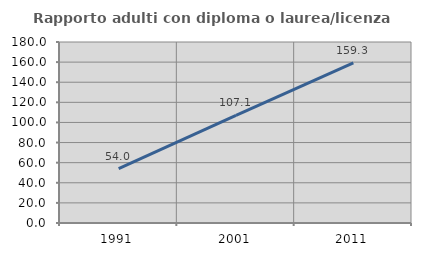
| Category | Rapporto adulti con diploma o laurea/licenza media  |
|---|---|
| 1991.0 | 54.018 |
| 2001.0 | 107.119 |
| 2011.0 | 159.295 |